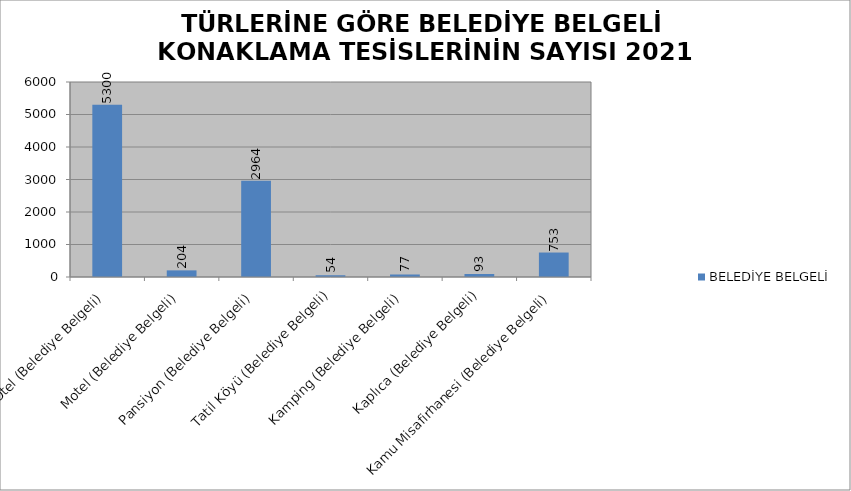
| Category | BELEDİYE BELGELİ |
|---|---|
| Otel (Belediye Belgeli) | 5300 |
| Motel (Belediye Belgeli) | 204 |
| Pansiyon (Belediye Belgeli) | 2964 |
| Tatil Köyü (Belediye Belgeli) | 54 |
| Kamping (Belediye Belgeli) | 77 |
| Kaplıca (Belediye Belgeli) | 93 |
| Kamu Misafirhanesi (Belediye Belgeli) | 753 |